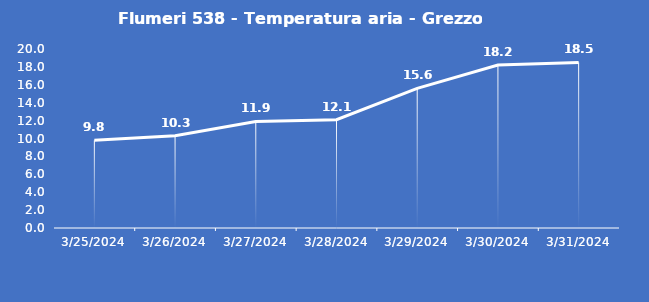
| Category | Flumeri 538 - Temperatura aria - Grezzo (°C) |
|---|---|
| 3/25/24 | 9.8 |
| 3/26/24 | 10.3 |
| 3/27/24 | 11.9 |
| 3/28/24 | 12.1 |
| 3/29/24 | 15.6 |
| 3/30/24 | 18.2 |
| 3/31/24 | 18.5 |